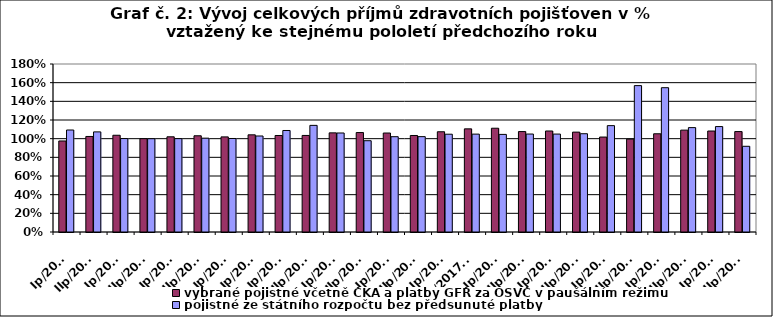
| Category | vybrané pojistné včetně ČKA a platby GFŘ za OSVČ v paušálním režimu | pojistné ze státního rozpočtu bez předsunuté platby |
|---|---|---|
| Ip/2010 | 0.975 | 1.093 |
| IIp/2010 | 1.024 | 1.073 |
| Ip/2011 | 1.037 | 1.001 |
| IIp/2011 | 1 | 0.999 |
| Ip/2012 | 1.02 | 1 |
| IIp/2012 | 1.031 | 1.005 |
| Ip/2013 | 1.019 | 1.002 |
| Ip/2013 | 1.041 | 1.029 |
| Ip/2014 | 1.034 | 1.088 |
| IIp/2014 | 1.035 | 1.143 |
| Ip/2015 | 1.062 | 1.061 |
| IIp/2015 | 1.065 | 0.978 |
| Ip/2016 | 1.06 | 1.021 |
| IIp/2016 | 1.034 | 1.022 |
| Ip/2017 | 1.074 | 1.048 |
| IIp/2017 *) | 1.105 | 1.049 |
| Ip/2018 | 1.112 | 1.046 |
| IIp/2018 | 1.076 | 1.05 |
| Ip/2019 | 1.082 | 1.049 |
| IIp/2019 | 1.07 | 1.053 |
| Ip/2020 | 1.017 | 1.14 |
| IIp/2020 | 0.995 | 1.568 |
| Ip/2021 | 1.052 | 1.546 |
| IIp/2021 | 1.091 | 1.118 |
| Ip/2022 | 1.082 | 1.13 |
| IIp/2022 | 1.076 | 0.918 |